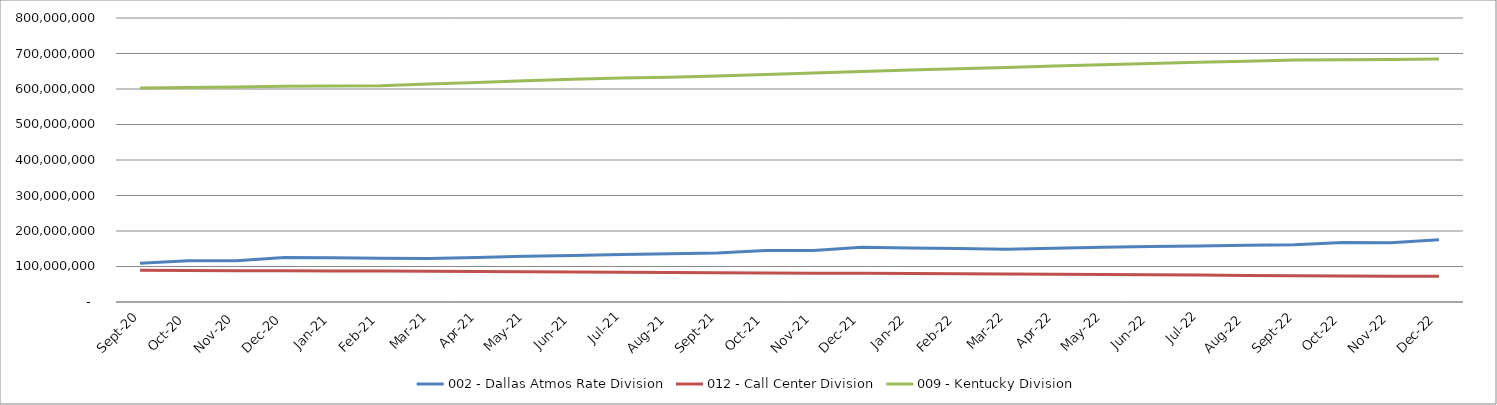
| Category | 002 - Dallas Atmos Rate Division | 012 - Call Center Division | 009 - Kentucky Division |
|---|---|---|---|
| 2020-09-30 | 108971017.12 | 89416484.8 | 602727618.13 |
| 2020-10-31 | 115966881.21 | 88792734.71 | 604376999.44 |
| 2020-11-30 | 116164050.82 | 88060725.61 | 605314205.05 |
| 2020-12-31 | 125500880.08 | 88078752.16 | 607656303.63 |
| 2021-01-31 | 124502134.25 | 87346975.42 | 608738605.28 |
| 2021-02-28 | 123435121.2 | 87148527.56 | 609121043.41 |
| 2021-03-31 | 122337015.1 | 86412990.07 | 613845777.35 |
| 2021-04-30 | 125387006.811 | 85752237.843 | 618461025.556 |
| 2021-05-31 | 128526797.541 | 85092048.351 | 622943971.792 |
| 2021-06-30 | 131242183.785 | 84430829.451 | 627410209.305 |
| 2021-07-31 | 133675861.15 | 83769166.058 | 630973084.591 |
| 2021-08-31 | 135995162.651 | 83106490.639 | 633171612.466 |
| 2021-09-30 | 138375445.945 | 82449830.994 | 636774493.603 |
| 2021-10-31 | 145068821.154 | 81811898.937 | 640756625.327 |
| 2021-11-30 | 144947557.171 | 81065016.786 | 644861772.97 |
| 2021-12-31 | 153952371.34 | 81071138.144 | 649343950.301 |
| 2022-01-31 | 152284135.881 | 80190683.4 | 653409207.416 |
| 2022-02-28 | 150614066.765 | 79841351.68 | 657243483.02 |
| 2022-03-31 | 148905399.022 | 78954908.041 | 660899208.061 |
| 2022-04-30 | 151408335.614 | 78148877.506 | 664558079.873 |
| 2022-05-31 | 153921533.842 | 77342539.52 | 668291325.87 |
| 2022-06-30 | 156003104.729 | 76534978.277 | 671903556.422 |
| 2022-07-31 | 157868877.617 | 75726774.763 | 675333750.013 |
| 2022-08-31 | 159567764.091 | 74917366.265 | 678467953.145 |
| 2022-09-30 | 161394210.338 | 74113719.681 | 681527181.459 |
| 2022-10-31 | 167445767.022 | 73328418.331 | 682362673.405 |
| 2022-11-30 | 166680379.809 | 72434865.174 | 683192021.239 |
| 2022-12-31 | 175097159.372 | 72287664.104 | 684215428.678 |